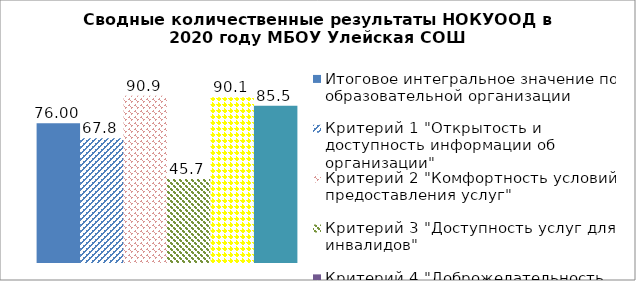
| Category | Итоговое интегральное значение по образовательной организации | Критерий 1 "Открытость и доступность информации об организации" | Критерий 2 "Комфортность условий предоставления услуг" | Критерий 3 "Доступность услуг для инвалидов" | Критерий 4 "Доброжелательность, вежливость работников" | Критерий 5 "Удовлетворенность условиями оказания услуг" |
|---|---|---|---|---|---|---|
| 0 | 76 | 67.8 | 90.9 | 45.7 | 90.1 | 85.5 |